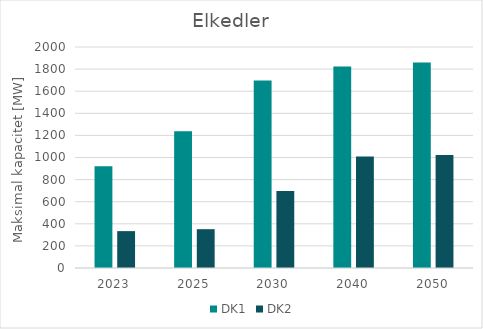
| Category | DK1 | DK2 |
|---|---|---|
| 2023.0 | 920.05 | 333.8 |
| 2025.0 | 1236.63 | 351.278 |
| 2030.0 | 1697.93 | 697.11 |
| 2040.0 | 1824.52 | 1008.367 |
| 2050.0 | 1860.65 | 1021.714 |